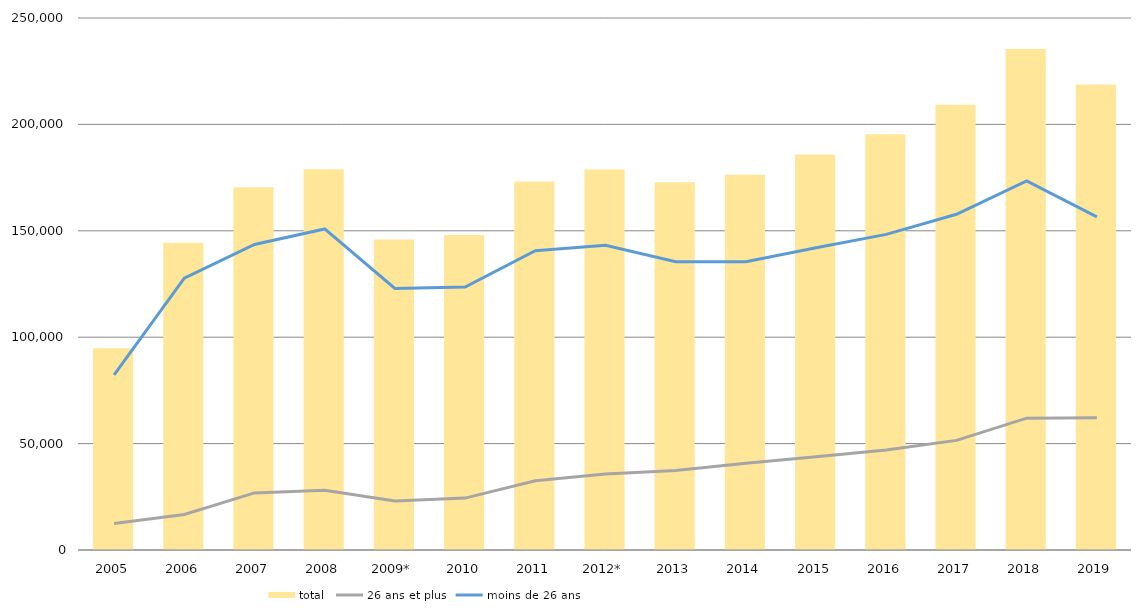
| Category | total |
|---|---|
| 2005 | 94792 |
| 2006 | 144430 |
| 2007 | 170445 |
| 2008 | 178955 |
| 2009* | 145950 |
| 2010 | 147990 |
| 2011 | 173185 |
| 2012* | 178828 |
| 2013 | 172821 |
| 2014 | 176308 |
| 2015 | 185879 |
| 2016 | 195326 |
| 2017 | 209277 |
| 2018 | 235401 |
| 2019 | 218697 |